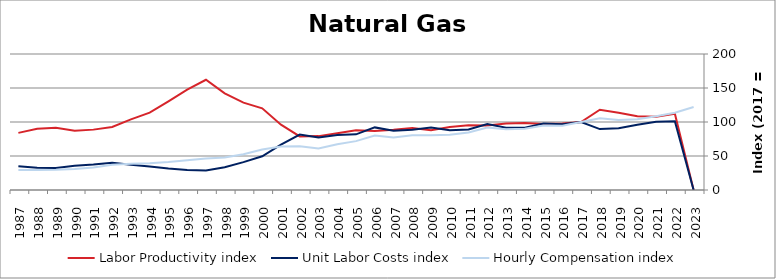
| Category | Labor Productivity index | Unit Labor Costs index | Hourly Compensation index |
|---|---|---|---|
| 2023.0 | 0 | 0 | 121.983 |
| 2022.0 | 112.283 | 101.089 | 113.506 |
| 2021.0 | 107.832 | 100.45 | 108.318 |
| 2020.0 | 108.385 | 96.039 | 104.093 |
| 2019.0 | 113.464 | 90.757 | 102.977 |
| 2018.0 | 118.008 | 89.541 | 105.665 |
| 2017.0 | 100 | 100 | 100 |
| 2016.0 | 97.877 | 96.655 | 94.603 |
| 2015.0 | 96.922 | 97.816 | 94.805 |
| 2014.0 | 98.517 | 91.48 | 90.123 |
| 2013.0 | 97.675 | 91.554 | 89.426 |
| 2012.0 | 94.689 | 96.934 | 91.786 |
| 2011.0 | 95.083 | 89.071 | 84.691 |
| 2010.0 | 92.578 | 87.877 | 81.355 |
| 2009.0 | 87.743 | 91.81 | 80.557 |
| 2008.0 | 91.011 | 88.627 | 80.66 |
| 2007.0 | 88.562 | 87.166 | 77.196 |
| 2006.0 | 86.921 | 92.072 | 80.03 |
| 2005.0 | 87.756 | 81.875 | 71.851 |
| 2004.0 | 83.364 | 80.878 | 67.423 |
| 2003.0 | 79.234 | 77.077 | 61.071 |
| 2002.0 | 78.725 | 81.567 | 64.213 |
| 2001.0 | 96.074 | 66.674 | 64.057 |
| 2000.0 | 120.184 | 49.653 | 59.674 |
| 1999.0 | 128.426 | 41.004 | 52.66 |
| 1998.0 | 142.178 | 33.595 | 47.764 |
| 1997.0 | 162.098 | 28.632 | 46.412 |
| 1996.0 | 147.644 | 29.56 | 43.644 |
| 1995.0 | 130.327 | 31.562 | 41.134 |
| 1994.0 | 113.807 | 34.703 | 39.495 |
| 1993.0 | 103.78 | 37.185 | 38.59 |
| 1992.0 | 92.593 | 40.101 | 37.131 |
| 1991.0 | 88.784 | 37.381 | 33.189 |
| 1990.0 | 87.028 | 35.669 | 31.042 |
| 1989.0 | 91.503 | 32.407 | 29.654 |
| 1988.0 | 90.095 | 32.739 | 29.496 |
| 1987.0 | 84.007 | 34.86 | 29.285 |